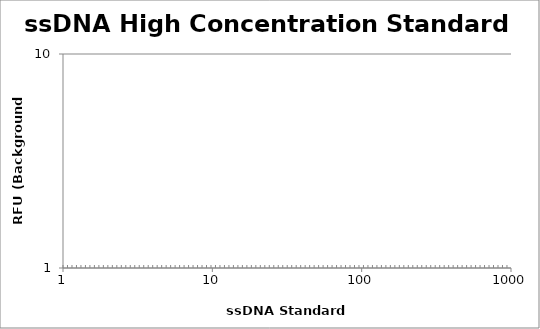
| Category | Average |
|---|---|
| 400.0 | 0 |
| 200.0 | 0 |
| 100.0 | 0 |
| 50.0 | 0 |
| 25.0 | 0 |
| 12.5 | 0 |
| 6.25 | 0 |